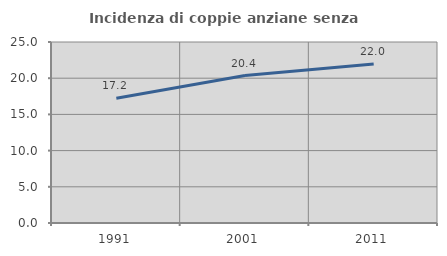
| Category | Incidenza di coppie anziane senza figli  |
|---|---|
| 1991.0 | 17.241 |
| 2001.0 | 20.37 |
| 2011.0 | 21.951 |